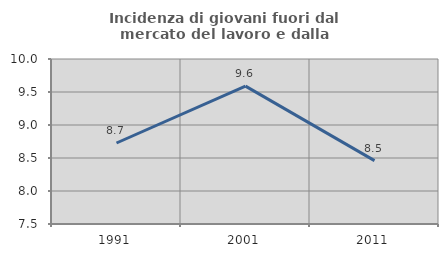
| Category | Incidenza di giovani fuori dal mercato del lavoro e dalla formazione  |
|---|---|
| 1991.0 | 8.727 |
| 2001.0 | 9.589 |
| 2011.0 | 8.46 |